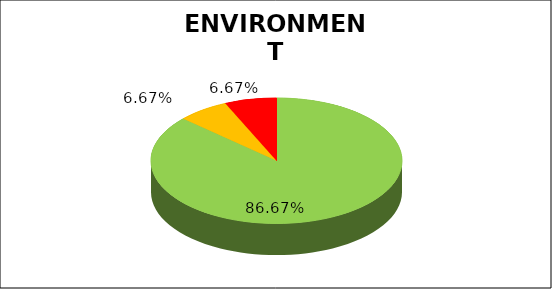
| Category | Series 0 |
|---|---|
| Green | 0.867 |
| Amber | 0.067 |
| Red | 0.067 |